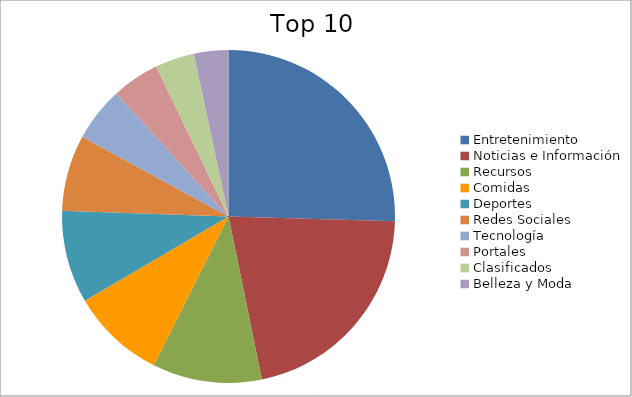
| Category | Series 0 |
|---|---|
| Entretenimiento | 22.41 |
| Noticias e Información | 18.78 |
| Recursos | 9.35 |
| Comidas | 8.06 |
| Deportes | 7.92 |
| Redes Sociales | 6.5 |
| Tecnología | 4.67 |
| Portales | 4.05 |
| Clasificados | 3.36 |
| Belleza y Moda | 2.94 |